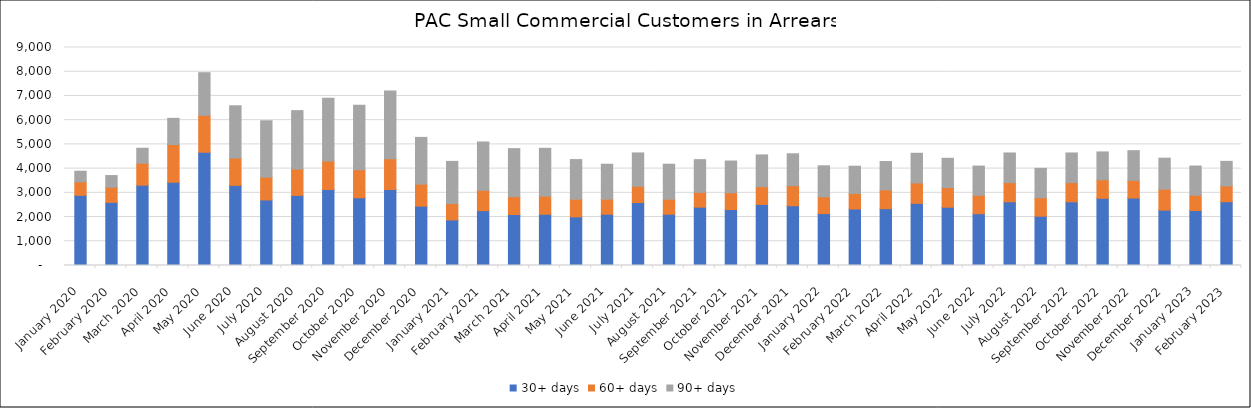
| Category | 30+ days | 60+ days | 90+ days |
|---|---|---|---|
| 2020-01-01 | 2897 | 557 | 438 |
| 2020-02-01 | 2605 | 627 | 481 |
| 2020-03-01 | 3315 | 905 | 620 |
| 2020-04-01 | 3437 | 1559 | 1079 |
| 2020-05-01 | 4675 | 1526 | 1758 |
| 2020-06-01 | 3308 | 1129 | 2157 |
| 2020-07-01 | 2706 | 942 | 2327 |
| 2020-08-01 | 2894 | 1088 | 2411 |
| 2020-09-01 | 3138 | 1177 | 2588 |
| 2020-10-01 | 2795 | 1162 | 2655 |
| 2020-11-01 | 3137 | 1272 | 2793 |
| 2020-12-01 | 2450 | 910 | 1929 |
| 2021-01-01 | 1881 | 673 | 1744 |
| 2021-02-01 | 2265 | 840 | 1994 |
| 2021-03-01 | 2105 | 737 | 1983 |
| 2021-04-01 | 2116 | 746 | 1976 |
| 2021-05-01 | 2009 | 726 | 1638 |
| 2021-06-01 | 2117 | 617 | 1447 |
| 2021-07-01 | 2602 | 669 | 1376 |
| 2021-08-01 | 2117 | 617 | 1447 |
| 2021-09-01 | 2408 | 612 | 1350 |
| 2021-10-01 | 2312 | 693 | 1308 |
| 2021-11-01 | 2520 | 735 | 1310 |
| 2021-12-01 | 2466 | 830 | 1316 |
| 2022-01-01 | 2144 | 690 | 1282 |
| 2022-02-01 | 2333 | 641 | 1124 |
| 2022-03-01 | 2345 | 776 | 1171 |
| 2022-04-01 | 2565 | 842 | 1226 |
| 2022-05-01 | 2406 | 811 | 1208 |
| 2022-06-01 | 2138 | 760 | 1207 |
| 2022-07-01 | 2630 | 792 | 1224 |
| 2022-08-01 | 2035 | 762 | 1215 |
| 2022-09-01 | 2630 | 792 | 1224 |
| 2022-10-01 | 2774 | 766 | 1150 |
| 2022-11-01 | 2785 | 728 | 1228 |
| 2022-12-01 | 2286 | 864 | 1281 |
| 2023-01-01 | 2270 | 629 | 1207 |
| 2023-02-01 | 2632 | 653 | 1015 |